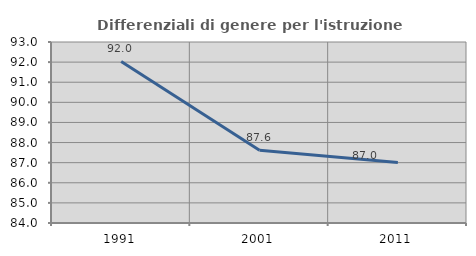
| Category | Differenziali di genere per l'istruzione superiore |
|---|---|
| 1991.0 | 92.031 |
| 2001.0 | 87.618 |
| 2011.0 | 87.003 |